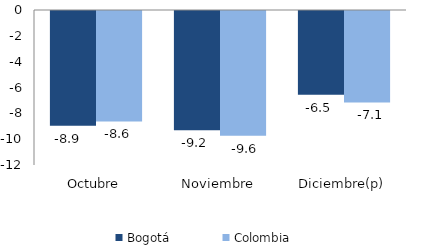
| Category | Bogotá | Colombia |
|---|---|---|
| Octubre | -8.882 | -8.551 |
| Noviembre | -9.223 | -9.649 |
| Diciembre(p) | -6.475 | -7.075 |